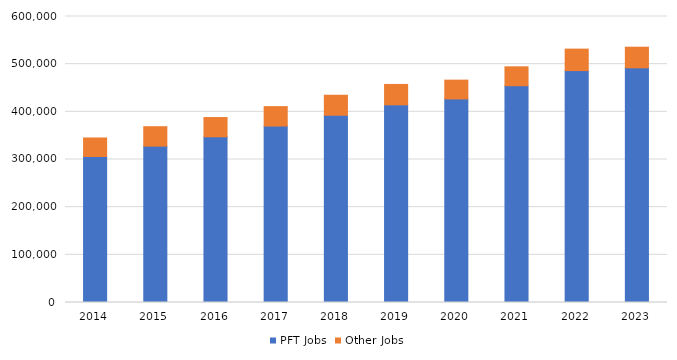
| Category | PFT Jobs | Other Jobs |
|---|---|---|
| 2014 | 306231 | 38910 |
| 2015 | 328005 | 40813 |
| 2016 | 347630 | 40410 |
| 2017 | 370171 | 40765 |
| 2018 | 392887 | 41910 |
| 2019 | 414702 | 42762 |
| 2020 | 427041 | 39447 |
| 2021 | 454782 | 39648 |
| 2022 | 486514 | 45057 |
| 2023 | 492320 | 43284 |